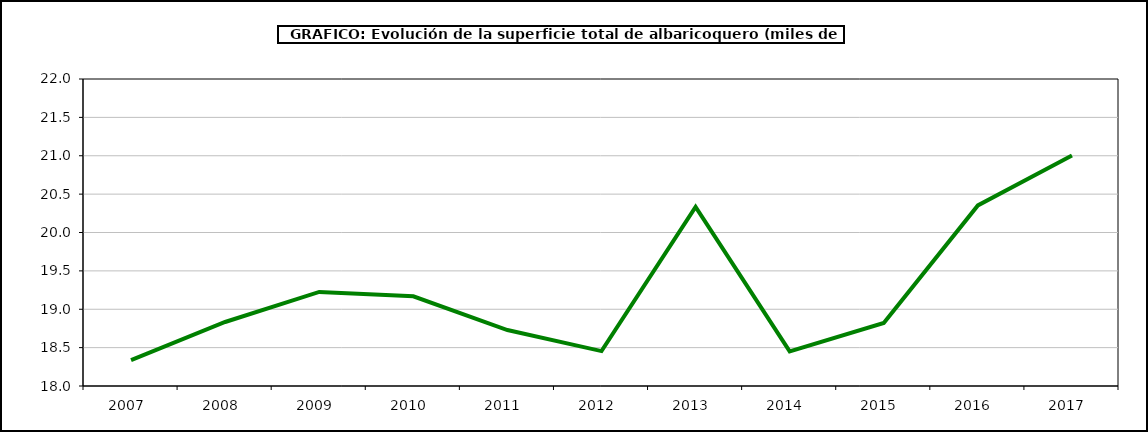
| Category | superficie albaricoquero |
|---|---|
| 2007.0 | 18.338 |
| 2008.0 | 18.834 |
| 2009.0 | 19.226 |
| 2010.0 | 19.169 |
| 2011.0 | 18.729 |
| 2012.0 | 18.455 |
| 2013.0 | 20.334 |
| 2014.0 | 18.451 |
| 2015.0 | 18.822 |
| 2016.0 | 20.353 |
| 2017.0 | 21.002 |